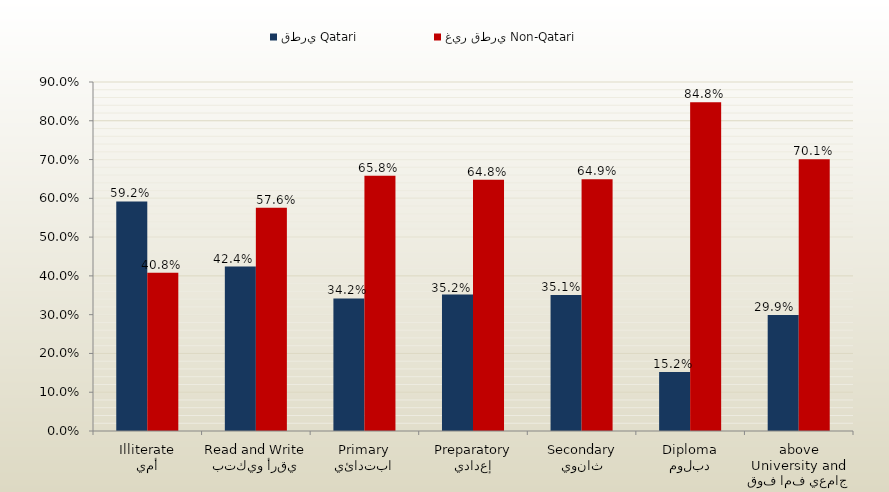
| Category | قطري Qatari | غير قطري Non-Qatari |
|---|---|---|
| أمي
Illiterate | 0.592 | 0.408 |
| يقرأ ويكتب
Read and Write | 0.424 | 0.576 |
| ابتدائي
Primary | 0.342 | 0.658 |
| إعدادي
Preparatory | 0.352 | 0.648 |
| ثانوي
Secondary | 0.351 | 0.649 |
| دبلوم
Diploma | 0.152 | 0.848 |
| جامعي فما فوق
University and above | 0.299 | 0.701 |